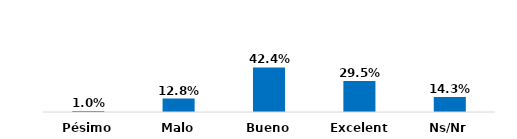
| Category | Series 0 |
|---|---|
| Pésimo | 0.01 |
| Malo | 0.128 |
| Bueno | 0.424 |
| Excelente | 0.295 |
| Ns/Nr | 0.143 |